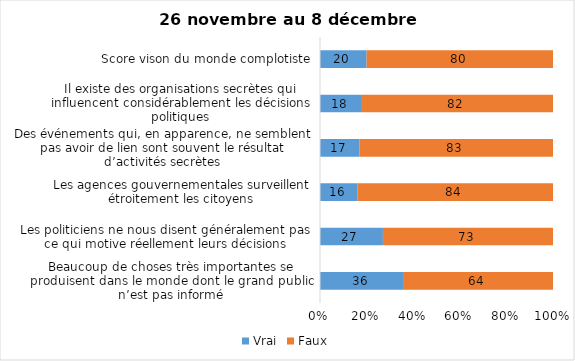
| Category | Vrai | Faux |
|---|---|---|
| Beaucoup de choses très importantes se produisent dans le monde dont le grand public n’est pas informé | 36 | 64 |
| Les politiciens ne nous disent généralement pas ce qui motive réellement leurs décisions | 27 | 73 |
| Les agences gouvernementales surveillent étroitement les citoyens | 16 | 84 |
| Des événements qui, en apparence, ne semblent pas avoir de lien sont souvent le résultat d’activités secrètes | 17 | 83 |
| Il existe des organisations secrètes qui influencent considérablement les décisions politiques | 18 | 82 |
| Score vison du monde complotiste | 20 | 80 |